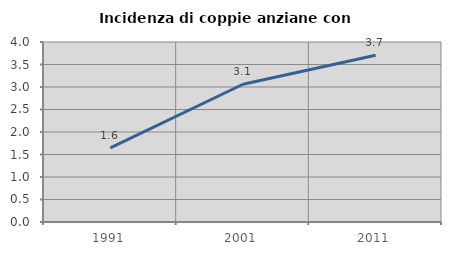
| Category | Incidenza di coppie anziane con figli |
|---|---|
| 1991.0 | 1.646 |
| 2001.0 | 3.061 |
| 2011.0 | 3.704 |